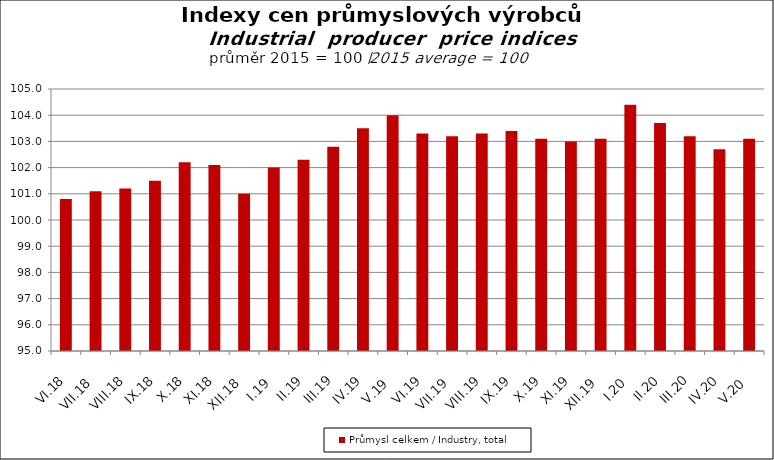
| Category | Průmysl celkem / Industry, total |
|---|---|
| VI.18 | 100.8 |
| VII.18 | 101.1 |
| VIII.18 | 101.2 |
| IX.18 | 101.5 |
| X.18 | 102.2 |
| XI.18 | 102.1 |
| XII.18 | 101 |
| I.19 | 102 |
| II.19 | 102.3 |
| III.19 | 102.8 |
| IV.19 | 103.5 |
| V.19 | 104 |
| VI.19 | 103.3 |
| VII.19 | 103.2 |
| VIII.19 | 103.3 |
| IX.19 | 103.4 |
| X.19 | 103.1 |
| XI.19 | 103 |
| XII.19 | 103.1 |
| I.20 | 104.4 |
| II.20 | 103.7 |
| III.20 | 103.2 |
| IV.20 | 102.7 |
| V.20 | 103.1 |